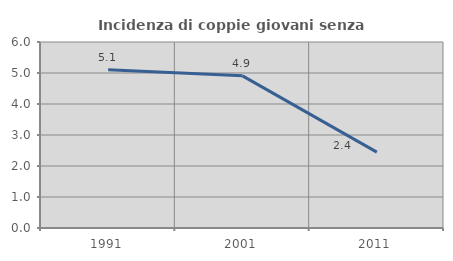
| Category | Incidenza di coppie giovani senza figli |
|---|---|
| 1991.0 | 5.104 |
| 2001.0 | 4.908 |
| 2011.0 | 2.448 |